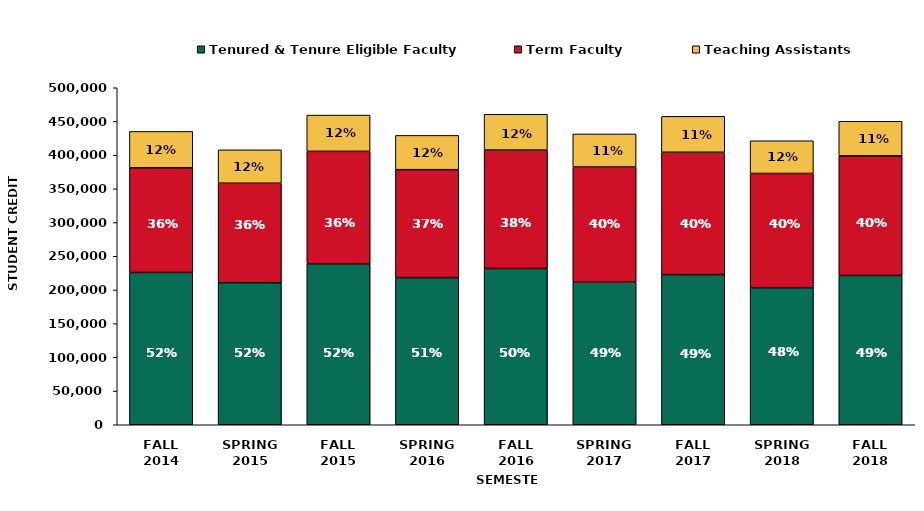
| Category | Tenured & Tenure Eligible Faculty | Term Faculty | Teaching Assistants |
|---|---|---|---|
| FALL
2014 | 225968 | 155272 | 53948 |
| SPRING
2015 | 210706 | 147660.64 | 49533.43 |
| FALL
2015 | 238831 | 166827.4 | 53818.6 |
| SPRING
2016 | 218266.1 | 160199.7 | 50835.7 |
| FALL
2016 | 231916.8 | 175652.3 | 53107 |
| SPRING
2017 | 211957 | 170476.6 | 49016 |
| FALL
2017 | 222732 | 181530.5 | 53325 |
| SPRING
2018 | 203344 | 169521.9 | 48517 |
| FALL
2018 | 221462.6 | 177514.4 | 51337.1 |